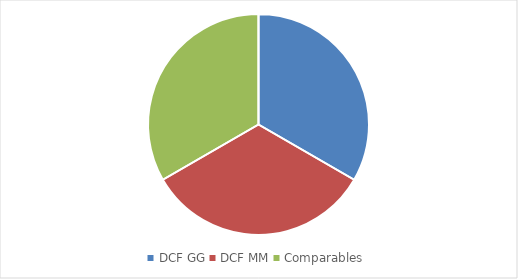
| Category | Weight |
|---|---|
| DCF GG | 0.33 |
| DCF MM | 0.33 |
| Comparables | 0.33 |